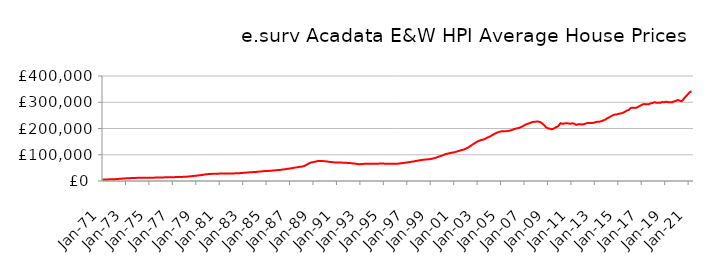
| Category | Series 0 |
|---|---|
| 1971-01-01 | 5721.637 |
| 1971-02-01 | 5762.296 |
| 1971-03-01 | 5803.295 |
| 1971-04-01 | 5856.6 |
| 1971-05-01 | 5945.059 |
| 1971-06-01 | 6037.239 |
| 1971-07-01 | 6150.593 |
| 1971-08-01 | 6273.935 |
| 1971-09-01 | 6396.293 |
| 1971-10-01 | 6523.41 |
| 1971-11-01 | 6660.635 |
| 1971-12-01 | 6827.73 |
| 1972-01-01 | 6943.709 |
| 1972-02-01 | 7019.642 |
| 1972-03-01 | 7192.485 |
| 1972-04-01 | 7434.182 |
| 1972-05-01 | 7783.4 |
| 1972-06-01 | 8089.841 |
| 1972-07-01 | 8442.17 |
| 1972-08-01 | 8782.047 |
| 1972-09-01 | 9082.157 |
| 1972-10-01 | 9362.629 |
| 1972-11-01 | 9622.344 |
| 1972-12-01 | 9890.271 |
| 1973-01-01 | 10081.941 |
| 1973-02-01 | 10217.371 |
| 1973-03-01 | 10373.062 |
| 1973-04-01 | 10550.653 |
| 1973-05-01 | 10778.346 |
| 1973-06-01 | 10926.279 |
| 1973-07-01 | 11081.212 |
| 1973-08-01 | 11253.08 |
| 1973-09-01 | 11453.654 |
| 1973-10-01 | 11661.609 |
| 1973-11-01 | 11820.086 |
| 1973-12-01 | 11933.729 |
| 1974-01-01 | 11994.68 |
| 1974-02-01 | 12060.371 |
| 1974-03-01 | 12057.68 |
| 1974-04-01 | 12031.652 |
| 1974-05-01 | 12008.684 |
| 1974-06-01 | 12009.52 |
| 1974-07-01 | 12021.199 |
| 1974-08-01 | 12060.402 |
| 1974-09-01 | 12131.717 |
| 1974-10-01 | 12219.316 |
| 1974-11-01 | 12291.911 |
| 1974-12-01 | 12363.582 |
| 1975-01-01 | 12396.74 |
| 1975-02-01 | 12438.568 |
| 1975-03-01 | 12512.8 |
| 1975-04-01 | 12618.502 |
| 1975-05-01 | 12746.827 |
| 1975-06-01 | 12815.529 |
| 1975-07-01 | 12882.897 |
| 1975-08-01 | 12975.913 |
| 1975-09-01 | 13101.794 |
| 1975-10-01 | 13241.651 |
| 1975-11-01 | 13364.792 |
| 1975-12-01 | 13496.487 |
| 1976-01-01 | 13589.21 |
| 1976-02-01 | 13676.529 |
| 1976-03-01 | 13736.277 |
| 1976-04-01 | 13799.828 |
| 1976-05-01 | 13882.974 |
| 1976-06-01 | 13937.373 |
| 1976-07-01 | 13997.548 |
| 1976-08-01 | 14086.604 |
| 1976-09-01 | 14214.053 |
| 1976-10-01 | 14357.689 |
| 1976-11-01 | 14472.621 |
| 1976-12-01 | 14575.256 |
| 1977-01-01 | 14632.325 |
| 1977-02-01 | 14697.865 |
| 1977-03-01 | 14740.363 |
| 1977-04-01 | 14790.21 |
| 1977-05-01 | 14867.201 |
| 1977-06-01 | 14937.016 |
| 1977-07-01 | 15022.857 |
| 1977-08-01 | 15140.588 |
| 1977-09-01 | 15284.567 |
| 1977-10-01 | 15446.76 |
| 1977-11-01 | 15618.347 |
| 1977-12-01 | 15842.314 |
| 1978-01-01 | 16008.634 |
| 1978-02-01 | 16138.444 |
| 1978-03-01 | 16313.376 |
| 1978-04-01 | 16548.702 |
| 1978-05-01 | 16925.958 |
| 1978-06-01 | 17307.721 |
| 1978-07-01 | 17769.442 |
| 1978-08-01 | 18243.045 |
| 1978-09-01 | 18698.842 |
| 1978-10-01 | 19152.07 |
| 1978-11-01 | 19574.7 |
| 1978-12-01 | 19992.283 |
| 1979-01-01 | 20240.686 |
| 1979-02-01 | 20407.294 |
| 1979-03-01 | 20822.308 |
| 1979-04-01 | 21391.186 |
| 1979-05-01 | 22117.161 |
| 1979-06-01 | 22577.858 |
| 1979-07-01 | 23056.032 |
| 1979-08-01 | 23594.497 |
| 1979-09-01 | 24239.606 |
| 1979-10-01 | 24928.227 |
| 1979-11-01 | 25501.578 |
| 1979-12-01 | 25947.078 |
| 1980-01-01 | 26191.666 |
| 1980-02-01 | 26381.777 |
| 1980-03-01 | 26625.705 |
| 1980-04-01 | 26911.328 |
| 1980-05-01 | 27245.442 |
| 1980-06-01 | 27424.169 |
| 1980-07-01 | 27586.236 |
| 1980-08-01 | 27736.009 |
| 1980-09-01 | 27841.614 |
| 1980-10-01 | 27909.24 |
| 1980-11-01 | 27961.216 |
| 1980-12-01 | 28071.794 |
| 1981-01-01 | 28137.528 |
| 1981-02-01 | 28237.242 |
| 1981-03-01 | 28337.226 |
| 1981-04-01 | 28471.422 |
| 1981-05-01 | 28607.481 |
| 1981-06-01 | 28653.642 |
| 1981-07-01 | 28675.655 |
| 1981-08-01 | 28681.095 |
| 1981-09-01 | 28627.074 |
| 1981-10-01 | 28528.492 |
| 1981-11-01 | 28437.987 |
| 1981-12-01 | 28428.134 |
| 1982-01-01 | 28384.207 |
| 1982-02-01 | 28403.446 |
| 1982-03-01 | 28560.962 |
| 1982-04-01 | 28826.348 |
| 1982-05-01 | 29123.624 |
| 1982-06-01 | 29232.109 |
| 1982-07-01 | 29313.958 |
| 1982-08-01 | 29470.039 |
| 1982-09-01 | 29723.125 |
| 1982-10-01 | 30023.812 |
| 1982-11-01 | 30323.377 |
| 1982-12-01 | 30694.881 |
| 1983-01-01 | 30977.174 |
| 1983-02-01 | 31219.783 |
| 1983-03-01 | 31472.577 |
| 1983-04-01 | 31785.86 |
| 1983-05-01 | 32196.746 |
| 1983-06-01 | 32519.187 |
| 1983-07-01 | 32870.27 |
| 1983-08-01 | 33203.815 |
| 1983-09-01 | 33470.441 |
| 1983-10-01 | 33688.574 |
| 1983-11-01 | 33894.414 |
| 1983-12-01 | 34164.762 |
| 1984-01-01 | 34326.341 |
| 1984-02-01 | 34490.39 |
| 1984-03-01 | 34801.858 |
| 1984-04-01 | 35233.922 |
| 1984-05-01 | 35728.512 |
| 1984-06-01 | 35947.792 |
| 1984-07-01 | 36131.309 |
| 1984-08-01 | 36410.916 |
| 1984-09-01 | 36857.095 |
| 1984-10-01 | 37373.309 |
| 1984-11-01 | 37772.28 |
| 1984-12-01 | 38049.568 |
| 1985-01-01 | 38126.541 |
| 1985-02-01 | 38232.92 |
| 1985-03-01 | 38494.448 |
| 1985-04-01 | 38861.795 |
| 1985-05-01 | 39281.243 |
| 1985-06-01 | 39443.336 |
| 1985-07-01 | 39593.189 |
| 1985-08-01 | 39852.962 |
| 1985-09-01 | 40286.193 |
| 1985-10-01 | 40780.974 |
| 1985-11-01 | 41196.83 |
| 1985-12-01 | 41529.429 |
| 1986-01-01 | 41658.708 |
| 1986-02-01 | 41790.707 |
| 1986-03-01 | 42176.28 |
| 1986-04-01 | 42734.024 |
| 1986-05-01 | 43430.153 |
| 1986-06-01 | 43851.604 |
| 1986-07-01 | 44282.443 |
| 1986-08-01 | 44796.764 |
| 1986-09-01 | 45443.204 |
| 1986-10-01 | 46141.317 |
| 1986-11-01 | 46774.998 |
| 1986-12-01 | 47365.819 |
| 1987-01-01 | 47708.6 |
| 1987-02-01 | 47992.425 |
| 1987-03-01 | 48608.074 |
| 1987-04-01 | 49436.983 |
| 1987-05-01 | 50427.396 |
| 1987-06-01 | 50986.248 |
| 1987-07-01 | 51520.875 |
| 1987-08-01 | 52109.244 |
| 1987-09-01 | 52747.907 |
| 1987-10-01 | 53409.041 |
| 1987-11-01 | 54028.462 |
| 1987-12-01 | 54670.064 |
| 1988-01-01 | 54975.068 |
| 1988-02-01 | 55238.121 |
| 1988-03-01 | 56158.153 |
| 1988-04-01 | 57542.733 |
| 1988-05-01 | 59626.022 |
| 1988-06-01 | 61728.232 |
| 1988-07-01 | 64203.536 |
| 1988-08-01 | 66480.514 |
| 1988-09-01 | 68233.782 |
| 1988-10-01 | 69689.501 |
| 1988-11-01 | 70860.28 |
| 1988-12-01 | 71899.755 |
| 1989-01-01 | 72443.122 |
| 1989-02-01 | 72902.486 |
| 1989-03-01 | 73682.173 |
| 1989-04-01 | 74674.86 |
| 1989-05-01 | 75726.533 |
| 1989-06-01 | 76186.029 |
| 1989-07-01 | 76498.876 |
| 1989-08-01 | 76645.547 |
| 1989-09-01 | 76519.1 |
| 1989-10-01 | 76165.266 |
| 1989-11-01 | 75694.544 |
| 1989-12-01 | 75310.879 |
| 1990-01-01 | 74965.571 |
| 1990-02-01 | 74951.401 |
| 1990-03-01 | 74436.887 |
| 1990-04-01 | 73769.099 |
| 1990-05-01 | 72988.276 |
| 1990-06-01 | 72615.68 |
| 1990-07-01 | 72298.179 |
| 1990-08-01 | 71988.705 |
| 1990-09-01 | 71553.822 |
| 1990-10-01 | 71056.748 |
| 1990-11-01 | 70595.419 |
| 1990-12-01 | 70399.45 |
| 1991-01-01 | 70261.691 |
| 1991-02-01 | 70335.512 |
| 1991-03-01 | 70223.689 |
| 1991-04-01 | 70149.821 |
| 1991-05-01 | 70052.594 |
| 1991-06-01 | 70009.084 |
| 1991-07-01 | 69962.851 |
| 1991-08-01 | 69897.993 |
| 1991-09-01 | 69786.979 |
| 1991-10-01 | 69588.396 |
| 1991-11-01 | 69263.131 |
| 1991-12-01 | 68919.119 |
| 1992-01-01 | 68578.405 |
| 1992-02-01 | 68526.157 |
| 1992-03-01 | 68048.234 |
| 1992-04-01 | 67471.368 |
| 1992-05-01 | 66834.583 |
| 1992-06-01 | 66626.137 |
| 1992-07-01 | 66476.266 |
| 1992-08-01 | 66161.735 |
| 1992-09-01 | 65490.411 |
| 1992-10-01 | 64657.436 |
| 1992-11-01 | 64092.776 |
| 1992-12-01 | 64109.213 |
| 1993-01-01 | 64267.822 |
| 1993-02-01 | 64548.5 |
| 1993-03-01 | 64800.703 |
| 1993-04-01 | 65116.213 |
| 1993-05-01 | 65385.205 |
| 1993-06-01 | 65415.975 |
| 1993-07-01 | 65435.438 |
| 1993-08-01 | 65489.316 |
| 1993-09-01 | 65448.33 |
| 1993-10-01 | 65330.402 |
| 1993-11-01 | 65253.231 |
| 1993-12-01 | 65481.666 |
| 1994-01-01 | 65795.911 |
| 1994-02-01 | 66187.658 |
| 1994-03-01 | 66172.726 |
| 1994-04-01 | 66012.999 |
| 1994-05-01 | 65872.726 |
| 1994-06-01 | 65885.299 |
| 1994-07-01 | 65964.465 |
| 1994-08-01 | 66127.292 |
| 1994-09-01 | 66386.103 |
| 1994-10-01 | 66699.652 |
| 1994-11-01 | 66848.045 |
| 1994-12-01 | 66760.501 |
| 1995-01-01 | 66271.317 |
| 1995-02-01 | 65850.218 |
| 1995-03-01 | 65691.881 |
| 1995-04-01 | 65526.898 |
| 1995-05-01 | 65554.846 |
| 1995-06-01 | 65415.772 |
| 1995-07-01 | 65558.368 |
| 1995-08-01 | 65621.703 |
| 1995-09-01 | 65659.154 |
| 1995-10-01 | 65635.619 |
| 1995-11-01 | 65718.381 |
| 1995-12-01 | 65799.005 |
| 1996-01-01 | 65822.874 |
| 1996-02-01 | 65782.824 |
| 1996-03-01 | 66000.184 |
| 1996-04-01 | 66256.695 |
| 1996-05-01 | 66744.04 |
| 1996-06-01 | 67100.794 |
| 1996-07-01 | 67683.378 |
| 1996-08-01 | 68247.062 |
| 1996-09-01 | 68816.57 |
| 1996-10-01 | 69231.247 |
| 1996-11-01 | 69670.904 |
| 1996-12-01 | 70292.598 |
| 1997-01-01 | 70738.527 |
| 1997-02-01 | 71213.588 |
| 1997-03-01 | 71619.33 |
| 1997-04-01 | 72277.827 |
| 1997-05-01 | 73137.953 |
| 1997-06-01 | 73791.083 |
| 1997-07-01 | 74252.184 |
| 1997-08-01 | 74987.177 |
| 1997-09-01 | 75644.772 |
| 1997-10-01 | 76496.497 |
| 1997-11-01 | 77092.068 |
| 1997-12-01 | 77848.446 |
| 1998-01-01 | 78297.188 |
| 1998-02-01 | 78971.066 |
| 1998-03-01 | 79558.894 |
| 1998-04-01 | 80288.676 |
| 1998-05-01 | 80807.089 |
| 1998-06-01 | 81125.572 |
| 1998-07-01 | 81506.943 |
| 1998-08-01 | 81863.791 |
| 1998-09-01 | 82224.992 |
| 1998-10-01 | 82464.657 |
| 1998-11-01 | 82744.276 |
| 1998-12-01 | 83080.436 |
| 1999-01-01 | 83577.993 |
| 1999-02-01 | 84571.705 |
| 1999-03-01 | 85447.682 |
| 1999-04-01 | 86316.681 |
| 1999-05-01 | 87268.309 |
| 1999-06-01 | 88275.026 |
| 1999-07-01 | 89460.227 |
| 1999-08-01 | 90994.233 |
| 1999-09-01 | 92557.97 |
| 1999-10-01 | 93994.71 |
| 1999-11-01 | 94970.284 |
| 1999-12-01 | 96280.655 |
| 2000-01-01 | 97325.701 |
| 2000-02-01 | 99209.663 |
| 2000-03-01 | 100688.495 |
| 2000-04-01 | 102265.077 |
| 2000-05-01 | 103063.262 |
| 2000-06-01 | 104041.767 |
| 2000-07-01 | 104914.739 |
| 2000-08-01 | 105728.177 |
| 2000-09-01 | 106483.482 |
| 2000-10-01 | 107259.346 |
| 2000-11-01 | 107898.373 |
| 2000-12-01 | 108711.995 |
| 2001-01-01 | 109371.114 |
| 2001-02-01 | 110393.728 |
| 2001-03-01 | 111350.355 |
| 2001-04-01 | 112525.531 |
| 2001-05-01 | 113793.316 |
| 2001-06-01 | 114844.266 |
| 2001-07-01 | 115990.605 |
| 2001-08-01 | 117133.207 |
| 2001-09-01 | 118167.979 |
| 2001-10-01 | 118862.601 |
| 2001-11-01 | 120047.789 |
| 2001-12-01 | 121360.722 |
| 2002-01-01 | 123114.809 |
| 2002-02-01 | 124819.005 |
| 2002-03-01 | 126855.333 |
| 2002-04-01 | 129047.909 |
| 2002-05-01 | 131523.479 |
| 2002-06-01 | 134030.721 |
| 2002-07-01 | 136776.102 |
| 2002-08-01 | 139215.035 |
| 2002-09-01 | 141803.563 |
| 2002-10-01 | 144227.825 |
| 2002-11-01 | 146357.451 |
| 2002-12-01 | 148702.365 |
| 2003-01-01 | 150794.009 |
| 2003-02-01 | 152510.864 |
| 2003-03-01 | 153898.607 |
| 2003-04-01 | 155226.269 |
| 2003-05-01 | 156353.205 |
| 2003-06-01 | 157259.237 |
| 2003-07-01 | 158057.815 |
| 2003-08-01 | 159627.899 |
| 2003-09-01 | 161267.535 |
| 2003-10-01 | 163410.624 |
| 2003-11-01 | 165491.163 |
| 2003-12-01 | 167233.597 |
| 2004-01-01 | 167957.067 |
| 2004-02-01 | 170238.124 |
| 2004-03-01 | 172480.568 |
| 2004-04-01 | 174513.653 |
| 2004-05-01 | 176743.804 |
| 2004-06-01 | 178895.701 |
| 2004-07-01 | 180975.64 |
| 2004-08-01 | 183049.298 |
| 2004-09-01 | 184672.192 |
| 2004-10-01 | 186320.382 |
| 2004-11-01 | 187184.644 |
| 2004-12-01 | 188206.909 |
| 2005-01-01 | 189021.112 |
| 2005-02-01 | 190183.952 |
| 2005-03-01 | 190005.817 |
| 2005-04-01 | 190071.875 |
| 2005-05-01 | 189485.539 |
| 2005-06-01 | 190073.366 |
| 2005-07-01 | 190099.846 |
| 2005-08-01 | 190409.416 |
| 2005-09-01 | 191025.705 |
| 2005-10-01 | 192128.229 |
| 2005-11-01 | 193022.749 |
| 2005-12-01 | 194589.472 |
| 2006-01-01 | 195561.889 |
| 2006-02-01 | 197180.233 |
| 2006-03-01 | 198290.018 |
| 2006-04-01 | 199521.21 |
| 2006-05-01 | 200291.878 |
| 2006-06-01 | 200874.24 |
| 2006-07-01 | 201753.772 |
| 2006-08-01 | 202945.476 |
| 2006-09-01 | 204665.909 |
| 2006-10-01 | 206669.853 |
| 2006-11-01 | 208271.992 |
| 2006-12-01 | 210431.706 |
| 2007-01-01 | 212236.573 |
| 2007-02-01 | 214691.924 |
| 2007-03-01 | 215960.598 |
| 2007-04-01 | 217668.208 |
| 2007-05-01 | 218745.526 |
| 2007-06-01 | 220436.757 |
| 2007-07-01 | 221128.98 |
| 2007-08-01 | 222903.284 |
| 2007-09-01 | 224639.27 |
| 2007-10-01 | 225909.983 |
| 2007-11-01 | 225637.65 |
| 2007-12-01 | 225795.991 |
| 2008-01-01 | 226230.744 |
| 2008-02-01 | 227150.677 |
| 2008-03-01 | 226536.237 |
| 2008-04-01 | 226088.749 |
| 2008-05-01 | 224583.894 |
| 2008-06-01 | 222870.934 |
| 2008-07-01 | 219624.904 |
| 2008-08-01 | 216697.269 |
| 2008-09-01 | 213087.292 |
| 2008-10-01 | 209193.305 |
| 2008-11-01 | 204692.274 |
| 2008-12-01 | 201599.231 |
| 2009-01-01 | 200403.32 |
| 2009-02-01 | 201116.809 |
| 2009-03-01 | 199383.582 |
| 2009-04-01 | 198315.606 |
| 2009-05-01 | 196756.715 |
| 2009-06-01 | 198255.489 |
| 2009-07-01 | 199781.16 |
| 2009-08-01 | 202057.625 |
| 2009-09-01 | 204651.712 |
| 2009-10-01 | 206995.738 |
| 2009-11-01 | 207417.779 |
| 2009-12-01 | 211553.202 |
| 2010-01-01 | 214966.047 |
| 2010-02-01 | 220222.605 |
| 2010-03-01 | 218833.653 |
| 2010-04-01 | 218095.869 |
| 2010-05-01 | 218270.945 |
| 2010-06-01 | 219021.418 |
| 2010-07-01 | 219694.86 |
| 2010-08-01 | 220453.705 |
| 2010-09-01 | 220333.072 |
| 2010-10-01 | 219430.502 |
| 2010-11-01 | 217758.718 |
| 2010-12-01 | 217843.886 |
| 2011-01-01 | 218308.872 |
| 2011-02-01 | 219903.599 |
| 2011-03-01 | 220093.176 |
| 2011-04-01 | 217992.594 |
| 2011-05-01 | 215269.271 |
| 2011-06-01 | 213677.232 |
| 2011-07-01 | 214756.836 |
| 2011-08-01 | 216261.648 |
| 2011-09-01 | 216160.859 |
| 2011-10-01 | 216413 |
| 2011-11-01 | 215076.714 |
| 2011-12-01 | 215195.615 |
| 2012-01-01 | 215831.279 |
| 2012-02-01 | 216608.392 |
| 2012-03-01 | 218433.925 |
| 2012-04-01 | 219229.758 |
| 2012-05-01 | 221315.79 |
| 2012-06-01 | 221273.57 |
| 2012-07-01 | 221114.337 |
| 2012-08-01 | 220621.314 |
| 2012-09-01 | 220819.802 |
| 2012-10-01 | 221141.866 |
| 2012-11-01 | 221164.226 |
| 2012-12-01 | 221860.869 |
| 2013-01-01 | 222596.882 |
| 2013-02-01 | 224450.937 |
| 2013-03-01 | 225296.589 |
| 2013-04-01 | 225849.652 |
| 2013-05-01 | 225718.614 |
| 2013-06-01 | 226002.925 |
| 2013-07-01 | 226930.605 |
| 2013-08-01 | 228408.536 |
| 2013-09-01 | 229824.697 |
| 2013-10-01 | 231209.99 |
| 2013-11-01 | 232088.932 |
| 2013-12-01 | 234238.428 |
| 2014-01-01 | 237365.145 |
| 2014-02-01 | 239694.72 |
| 2014-03-01 | 242055.681 |
| 2014-04-01 | 243338.29 |
| 2014-05-01 | 245816.756 |
| 2014-06-01 | 247723.782 |
| 2014-07-01 | 249499.817 |
| 2014-08-01 | 251313.134 |
| 2014-09-01 | 252749.811 |
| 2014-10-01 | 253554.587 |
| 2014-11-01 | 253513.511 |
| 2014-12-01 | 253886.163 |
| 2015-01-01 | 255260.291 |
| 2015-02-01 | 256442.252 |
| 2015-03-01 | 257148.908 |
| 2015-04-01 | 257702.233 |
| 2015-05-01 | 258891.89 |
| 2015-06-01 | 260266.761 |
| 2015-07-01 | 261578.962 |
| 2015-08-01 | 264001.261 |
| 2015-09-01 | 265964.492 |
| 2015-10-01 | 268628.509 |
| 2015-11-01 | 269111.396 |
| 2015-12-01 | 271150.763 |
| 2016-01-01 | 273132.57 |
| 2016-02-01 | 278749.158 |
| 2016-03-01 | 279015.252 |
| 2016-04-01 | 279083.931 |
| 2016-05-01 | 277191.159 |
| 2016-06-01 | 278300.659 |
| 2016-07-01 | 278735.279 |
| 2016-08-01 | 279550.537 |
| 2016-09-01 | 281143.525 |
| 2016-10-01 | 283844.145 |
| 2016-11-01 | 285456.064 |
| 2016-12-01 | 287658.857 |
| 2017-01-01 | 289822.876 |
| 2017-02-01 | 291690.019 |
| 2017-03-01 | 293217.574 |
| 2017-04-01 | 293135.305 |
| 2017-05-01 | 293034.824 |
| 2017-06-01 | 291896.223 |
| 2017-07-01 | 291758.358 |
| 2017-08-01 | 292226.381 |
| 2017-09-01 | 294023.961 |
| 2017-10-01 | 295304.478 |
| 2017-11-01 | 296276.989 |
| 2017-12-01 | 297197.81 |
| 2018-01-01 | 298811.713 |
| 2018-02-01 | 300029.625 |
| 2018-03-01 | 299205.749 |
| 2018-04-01 | 298409.542 |
| 2018-05-01 | 297506.941 |
| 2018-06-01 | 297959.121 |
| 2018-07-01 | 297018.79 |
| 2018-08-01 | 297858.66 |
| 2018-09-01 | 298624.478 |
| 2018-10-01 | 300545.418 |
| 2018-11-01 | 299652.448 |
| 2018-12-01 | 300349.168 |
| 2019-01-01 | 300797.826 |
| 2019-02-01 | 302149.078 |
| 2019-03-01 | 301209.863 |
| 2019-04-01 | 300448.054 |
| 2019-05-01 | 300433.595 |
| 2019-06-01 | 300235.304 |
| 2019-07-01 | 299725.745 |
| 2019-08-01 | 299567.415 |
| 2019-09-01 | 301214.163 |
| 2019-10-01 | 303183.912 |
| 2019-11-01 | 304171.981 |
| 2019-12-01 | 305068.282 |
| 2020-01-01 | 306394.673 |
| 2020-02-01 | 308840.949 |
| 2020-03-01 | 308740.649 |
| 2020-04-01 | 305672.847 |
| 2020-05-01 | 303107.22 |
| 2020-06-01 | 303831.054 |
| 2020-07-01 | 308016.897 |
| 2020-08-01 | 312773.16 |
| 2020-09-01 | 316877.07 |
| 2020-10-01 | 321602.805 |
| 2020-11-01 | 324086.846 |
| 2020-12-01 | 329155.225 |
| 2021-01-01 | 332612.218 |
| 2021-02-01 | 337707.782 |
| 2021-03-01 | 339578.621 |
| 2021-04-01 | 341822.242 |
| 2021-05-01 | 343657.593 |